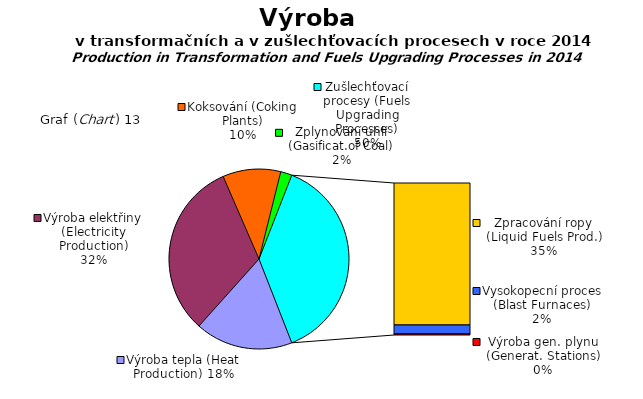
| Category | Series 0 |
|---|---|
| Výroba tepla (Heat Production) | 161696 |
| Výroba elektřiny (Electricity Production) | 293378.4 |
| Koksování (Coking Plants) | 95910.19 |
| Zplynování uhlí (Gasificat.of Coal) | 18818.166 |
| Zpracování ropy (Liquid Fuels Prod.) | 327991.606 |
| Vysokopecní proces (Blast Furnaces) | 20711.755 |
| Výroba gen. plynu (Generat. Stations) | 2455.537 |